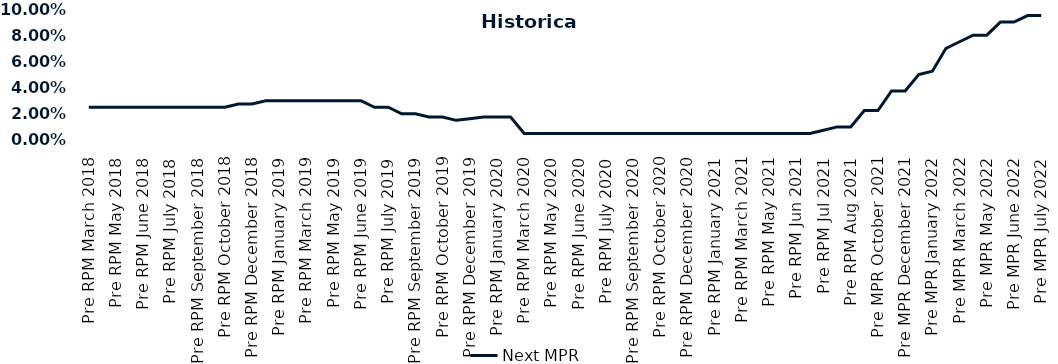
| Category | Next MPR |
|---|---|
| Pre RPM March 2018 | 0.025 |
| Post RPM March 2018 | 0.025 |
| Pre RPM May 2018 | 0.025 |
| Post RPM May 2018 | 0.025 |
| Pre RPM June 2018 | 0.025 |
| Post RPM June 2018 | 0.025 |
| Pre RPM July 2018 | 0.025 |
| Post RPM July 2018 | 0.025 |
| Pre RPM September 2018 | 0.025 |
| Post RPM September 2018 | 0.025 |
| Pre RPM October 2018 | 0.025 |
| Post RPM October 2018 | 0.028 |
| Pre RPM December 2018 | 0.028 |
| Post RPM December 2018 | 0.03 |
| Pre RPM January 2019 | 0.03 |
| Post RPM January 2019 | 0.03 |
| Pre RPM March 2019 | 0.03 |
| Post RPM March 2019 | 0.03 |
| Pre RPM May 2019 | 0.03 |
| Post RPM May 2019 | 0.03 |
| Pre RPM June 2019 | 0.03 |
| Post RPM June 2019 | 0.025 |
| Pre RPM July 2019 | 0.025 |
| Post RPM July 2019 | 0.02 |
| Pre RPM September 2019 | 0.02 |
| Post RPM September 2019 | 0.018 |
| Pre RPM October 2019 | 0.018 |
| Post RPM October 2019 | 0.015 |
| Pre RPM December 2019 | 0.016 |
| Post RPM December 2019 | 0.018 |
| Pre RPM January 2020 | 0.018 |
| Post RPM January 2020 | 0.018 |
| Pre RPM March 2020 | 0.005 |
| Post RPM March 2020 | 0.005 |
| Pre RPM May 2020 | 0.005 |
| Post RPM May 2020 | 0.005 |
| Pre RPM June 2020 | 0.005 |
| Post RPM June 2020 | 0.005 |
| Pre RPM July 2020 | 0.005 |
| Post RPM July 2020 | 0.005 |
| Pre RPM September 2020 | 0.005 |
| Post RPM September 2020 | 0.005 |
| Pre RPM October 2020 | 0.005 |
| Post RPM October 2020 | 0.005 |
| Pre RPM December 2020 | 0.005 |
|  Post RPM December 2020 | 0.005 |
| Pre RPM January 2021 | 0.005 |
| Post RPM January 2021 | 0.005 |
|  Pre RPM March 2021 | 0.005 |
|  Post RPM March 2021 | 0.005 |
|  Pre RPM May 2021 | 0.005 |
|  Post RPM May 2021 | 0.005 |
|  Pre RPM Jun 2021 | 0.005 |
|   Post RPM Jun 2021 | 0.005 |
| Pre RPM Jul 2021 | 0.008 |
|  Post RPM Jul 2021 | 0.01 |
| Pre RPM Aug 2021 | 0.01 |
|  Post RPM Aug 2021 | 0.022 |
| Pre MPR October 2021 | 0.022 |
| Post MPR October 2021 | 0.038 |
| Pre MPR December 2021 | 0.038 |
| Post MPR December 2021 | 0.05 |
| Pre MPR January 2022 | 0.052 |
| Post MPR January 2022 | 0.07 |
| Pre MPR March 2022 | 0.075 |
| Post MPR March 2022 | 0.08 |
| Pre MPR May 2022 | 0.08 |
| Post MPR May 2022 | 0.09 |
| Pre MPR June 2022 | 0.09 |
| Post MPR June 2022 | 0.095 |
| Pre MPR July 2022 | 0.095 |